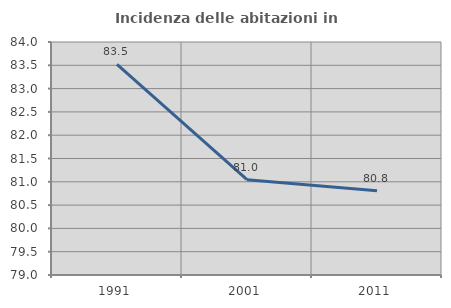
| Category | Incidenza delle abitazioni in proprietà  |
|---|---|
| 1991.0 | 83.521 |
| 2001.0 | 81.045 |
| 2011.0 | 80.809 |